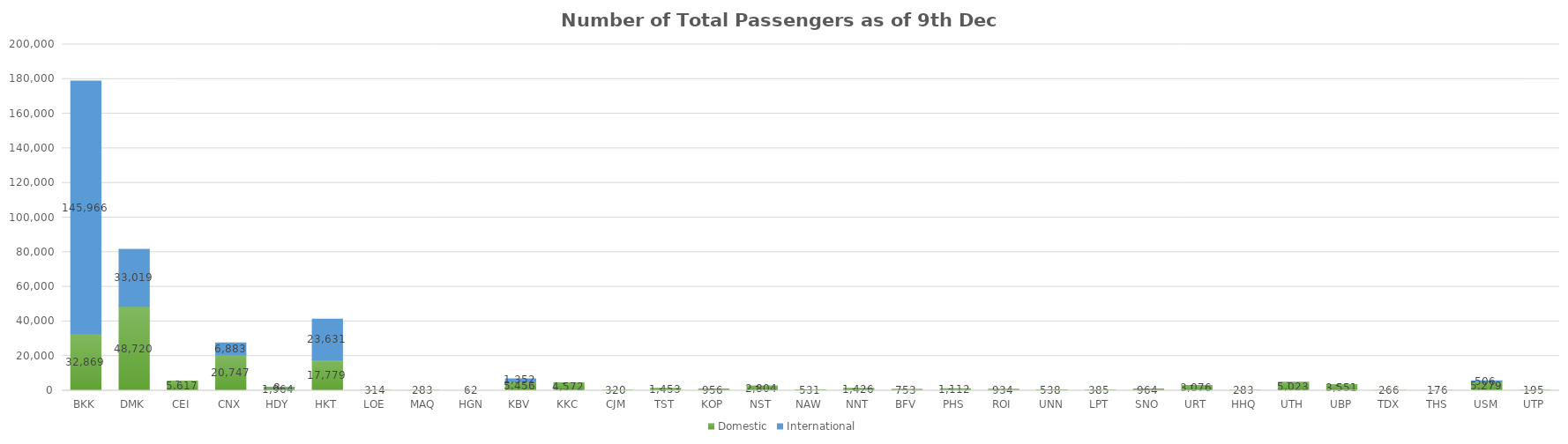
| Category | Domestic | International |
|---|---|---|
| BKK | 32869 | 145966 |
| DMK | 48720 | 33019 |
| CEI | 5617 | 0 |
| CNX | 20747 | 6883 |
| HDY | 1964 | 8 |
| HKT | 17779 | 23631 |
| LOE | 314 | 0 |
| MAQ | 283 | 0 |
| HGN | 62 | 0 |
| KBV | 5456 | 1352 |
| KKC | 4572 | 0 |
| CJM | 320 | 0 |
| TST | 1453 | 0 |
| KOP | 956 | 0 |
| NST | 2804 | 0 |
| NAW | 531 | 0 |
| NNT | 1426 | 0 |
| BFV | 753 | 0 |
| PHS | 1112 | 0 |
| ROI | 934 | 0 |
| UNN | 538 | 0 |
| LPT | 385 | 0 |
| SNO | 964 | 0 |
| URT | 3076 | 0 |
| HHQ | 283 | 0 |
| UTH | 5023 | 0 |
| UBP | 3551 | 0 |
| TDX | 266 | 0 |
| THS | 176 | 0 |
| USM | 5279 | 506 |
| UTP | 195 | 0 |